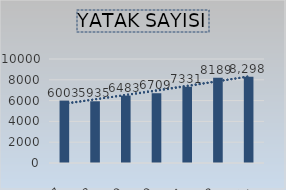
| Category | Series 6 |
|---|---|
| 2017 | 6003 |
| 2018 | 5935 |
| 2019 | 6483 |
| 2020 | 6709 |
| 2021 | 7331 |
| 2022 | 8189 |
| 2023(Aralık Ayı İtibariyle) | 8298 |